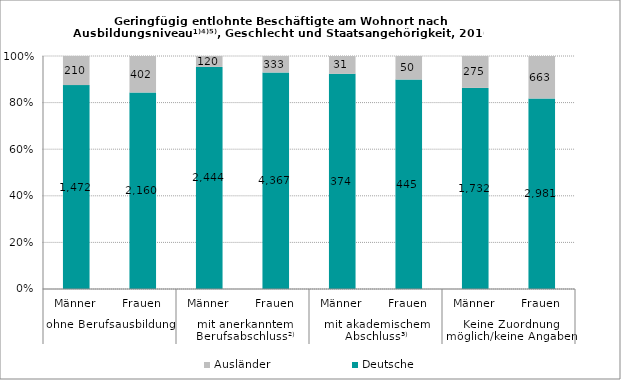
| Category | Deutsche | Ausländer |
|---|---|---|
| 0 | 1472 | 210 |
| 1 | 2160 | 402 |
| 2 | 2444 | 120 |
| 3 | 4367 | 333 |
| 4 | 374 | 31 |
| 5 | 445 | 50 |
| 6 | 1732 | 275 |
| 7 | 2981 | 663 |